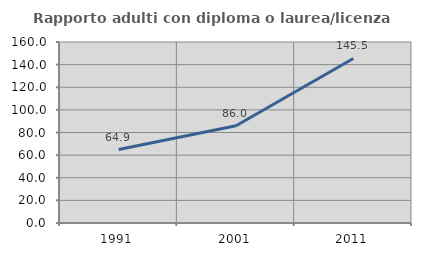
| Category | Rapporto adulti con diploma o laurea/licenza media  |
|---|---|
| 1991.0 | 64.948 |
| 2001.0 | 85.965 |
| 2011.0 | 145.455 |